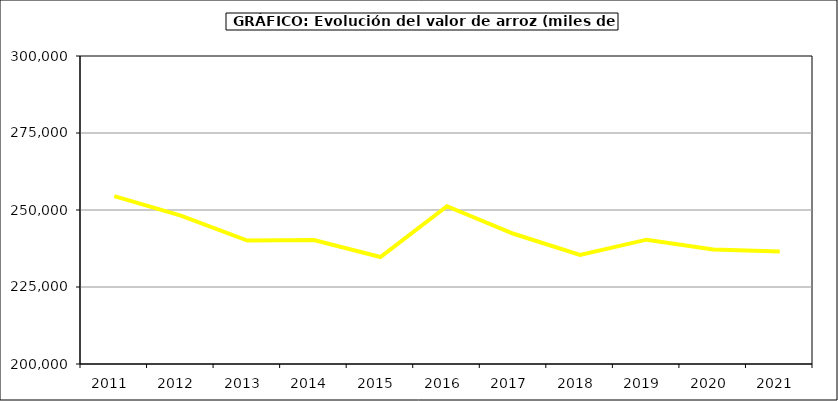
| Category | Valor |
|---|---|
| 2011.0 | 254491.862 |
| 2012.0 | 248198.159 |
| 2013.0 | 240076.744 |
| 2014.0 | 240232 |
| 2015.0 | 234720 |
| 2016.0 | 251228 |
| 2017.0 | 242285.097 |
| 2018.0 | 235443.207 |
| 2019.0 | 240367.543 |
| 2020.0 | 237164.184 |
| 2021.0 | 236504.538 |